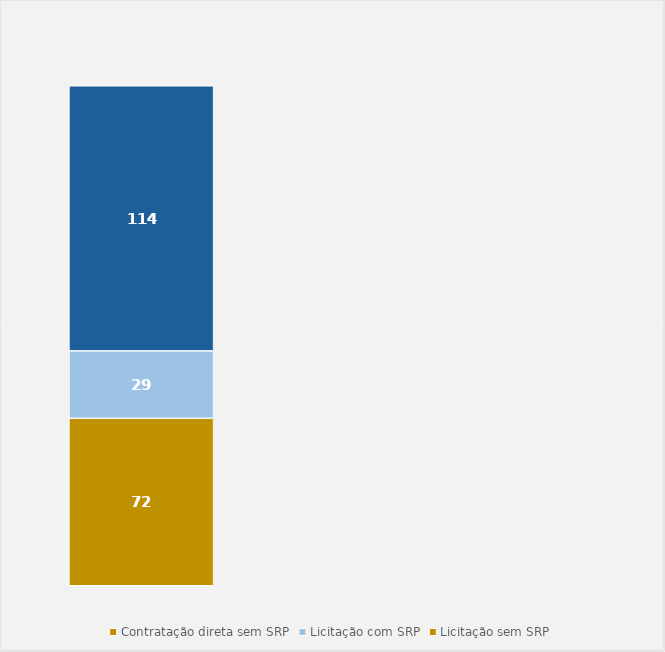
| Category | Contratação direta sem SRP | Licitação com SRP | Licitação sem SRP |
|---|---|---|---|
| Total | 72 | 29 | 114 |